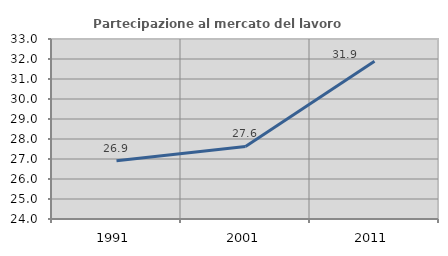
| Category | Partecipazione al mercato del lavoro  femminile |
|---|---|
| 1991.0 | 26.911 |
| 2001.0 | 27.625 |
| 2011.0 | 31.89 |